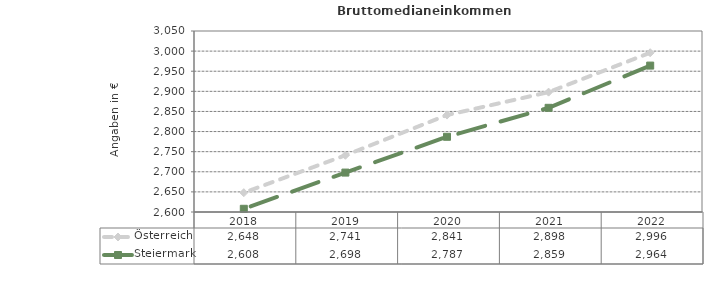
| Category | Österreich | Steiermark |
|---|---|---|
| 2022.0 | 2996 | 2964 |
| 2021.0 | 2898 | 2859 |
| 2020.0 | 2841 | 2787 |
| 2019.0 | 2741 | 2698 |
| 2018.0 | 2648 | 2608 |